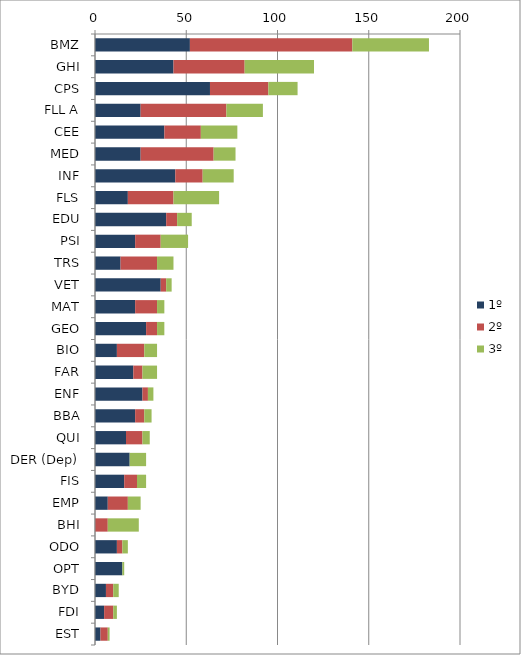
| Category | 1º | 2º | 3º |
|---|---|---|---|
| BMZ | 52 | 89 | 42 |
| GHI | 43 | 39 | 38 |
| CPS | 63 | 32 | 16 |
| FLL A | 25 | 47 | 20 |
| CEE | 38 | 20 | 20 |
| MED | 25 | 40 | 12 |
| INF | 44 | 15 | 17 |
| FLS | 18 | 25 | 25 |
| EDU | 39 | 6 | 8 |
| PSI | 22 | 14 | 15 |
| TRS | 14 | 20 | 9 |
| VET | 36 | 3 | 3 |
| MAT | 22 | 12 | 4 |
| GEO | 28 | 6 | 4 |
| BIO | 12 | 15 | 7 |
| FAR | 21 | 5 | 8 |
| ENF | 26 | 3 | 3 |
| BBA | 22 | 5 | 4 |
| QUI | 17 | 9 | 4 |
| DER (Dep) | 19 | 0 | 9 |
| FIS | 16 | 7 | 5 |
| EMP | 7 | 11 | 7 |
| BHI | 0 | 7 | 17 |
| ODO | 12 | 3 | 3 |
| OPT | 15 | 0 | 1 |
| BYD | 6 | 4 | 3 |
| FDI | 5 | 5 | 2 |
| EST | 3 | 4 | 1 |